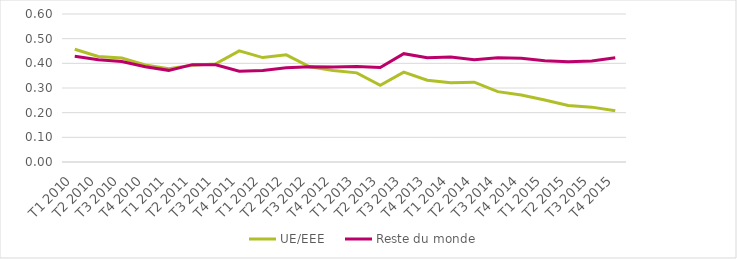
| Category | UE/EEE  | Reste du monde |
|---|---|---|
| T1 2010 | 0.457 | 0.429 |
| T2 2010 | 0.427 | 0.415 |
| T3 2010 | 0.422 | 0.407 |
| T4 2010 | 0.393 | 0.386 |
| T1 2011 | 0.378 | 0.372 |
| T2 2011 | 0.392 | 0.395 |
| T3 2011 | 0.398 | 0.394 |
| T4 2011 | 0.451 | 0.368 |
| T1 2012 | 0.423 | 0.371 |
| T2 2012 | 0.435 | 0.382 |
| T3 2012 | 0.386 | 0.387 |
| T4 2012 | 0.371 | 0.386 |
| T1 2013 | 0.361 | 0.387 |
| T2 2013 | 0.311 | 0.383 |
| T3 2013 | 0.364 | 0.439 |
| T4 2013 | 0.332 | 0.422 |
| T1 2014 | 0.321 | 0.425 |
| T2 2014 | 0.323 | 0.415 |
| T3 2014 | 0.285 | 0.422 |
| T4 2014 | 0.272 | 0.42 |
| T1 2015 | 0.252 | 0.41 |
| T2 2015 | 0.229 | 0.406 |
| T3 2015 | 0.222 | 0.41 |
| T4 2015 | 0.208 | 0.423 |